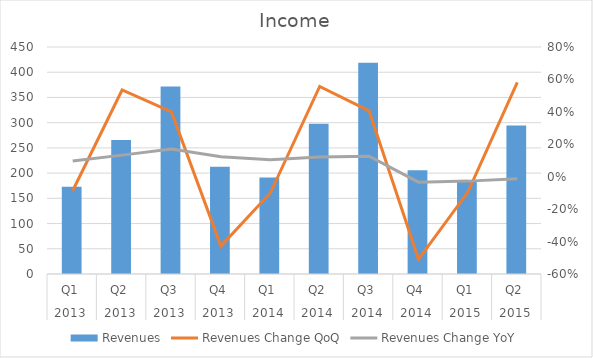
| Category | Revenues |
|---|---|
| 0 | 173.045 |
| 1 | 265.6 |
| 2 | 371.662 |
| 3 | 212.65 |
| 4 | 191.277 |
| 5 | 297.793 |
| 6 | 418.746 |
| 7 | 205.481 |
| 8 | 186.075 |
| 9 | 294.212 |